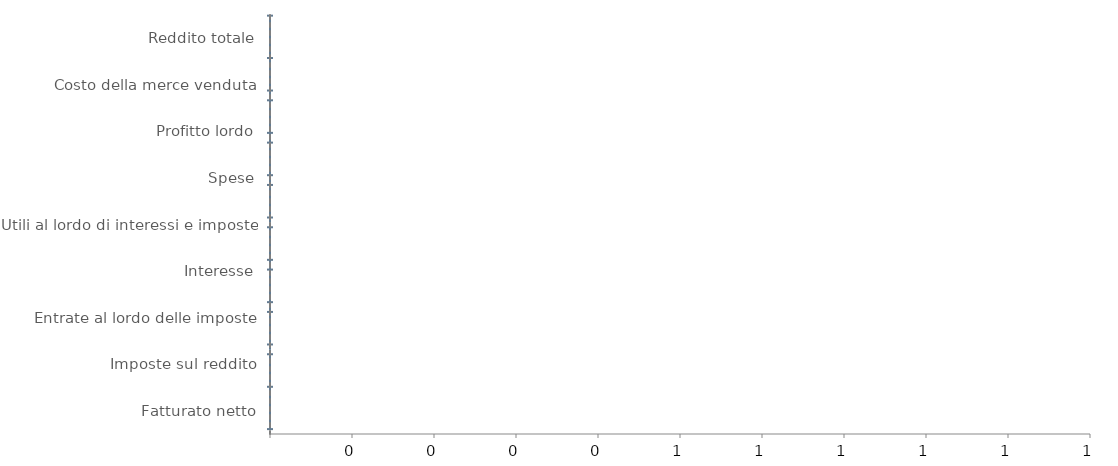
| Category | Fine | Vuoto | PerdNeg | GuadNeg | PerdPos | GuadPos |
|---|---|---|---|---|---|---|
| Reddito totale | 0 | 0 | 0 | 0 | 0 | 0 |
| Costo della merce venduta | 0 | 0 | 0 | 0 | 0 | 0 |
| Profitto lordo | 0 | 0 | 0 | 0 | 0 | 0 |
| Spese | 0 | 0 | 0 | 0 | 0 | 0 |
| Utili al lordo di interessi e imposte | 0 | 0 | 0 | 0 | 0 | 0 |
| Interesse | 0 | 0 | 0 | 0 | 0 | 0 |
| Entrate al lordo delle imposte | 0 | 0 | 0 | 0 | 0 | 0 |
| Imposte sul reddito | 0 | 0 | 0 | 0 | 0 | 0 |
| Fatturato netto | 0 | 0 | 0 | 0 | 0 | 0 |